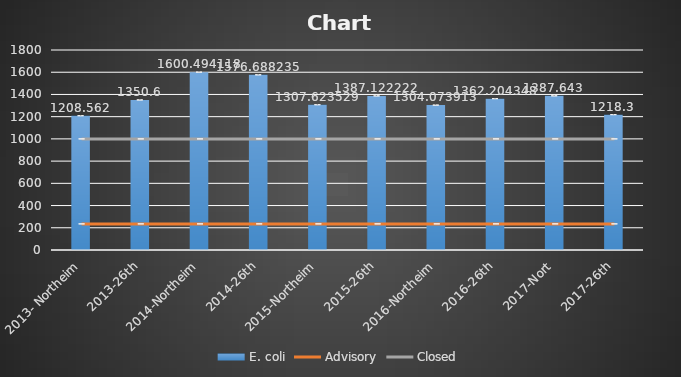
| Category | E. coli |
|---|---|
| 2013- Northeim | 1208.562 |
| 2013-26th | 1350.6 |
| 2014-Northeim | 1600.494 |
| 2014-26th | 1576.688 |
| 2015-Northeim | 1307.624 |
| 2015-26th | 1387.122 |
| 2016-Northeim | 1304.074 |
| 2016-26th | 1362.204 |
| 2017-Nort | 1387.643 |
| 2017-26th | 1218.3 |